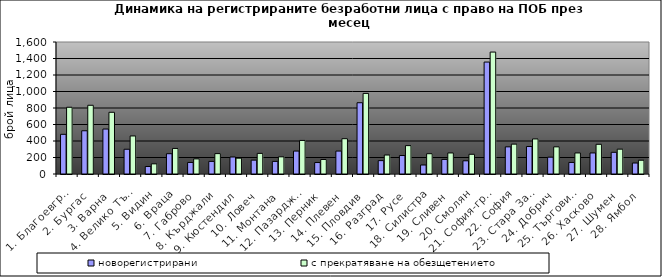
| Category | новорегистрирани | с прекратяване на обезщетението  |
|---|---|---|
| 1. Благоевград | 481 | 809 |
| 2. Бургас | 524 | 833 |
| 3. Варна | 545 | 748 |
| 4. Велико Търново | 300 | 461 |
| 5. Видин | 91 | 123 |
| 6. Враца | 246 | 310 |
| 7. Габрово | 140 | 183 |
| 8. Кърджали | 153 | 247 |
| 9. Кюстендил | 206 | 192 |
| 10. Ловеч | 168 | 250 |
| 11. Монтана | 153 | 208 |
| 12. Пазарджик | 278 | 407 |
| 13. Перник | 139 | 176 |
| 14. Плевен | 278 | 428 |
| 15. Пловдив | 864 | 977 |
| 16. Разград | 162 | 230 |
| 17. Русе | 224 | 344 |
| 18. Силистра | 109 | 246 |
| 19. Сливен | 177 | 255 |
| 20. Смолян | 160 | 239 |
| 21. София-град | 1357 | 1478 |
| 22. София | 329 | 362 |
| 23. Стара Загора | 333 | 425 |
| 24. Добрич | 204 | 329 |
| 25. Търговище | 140 | 255 |
| 26. Хасково | 255 | 360 |
| 27. Шумен | 263 | 301 |
| 28. Ямбол | 133 | 167 |